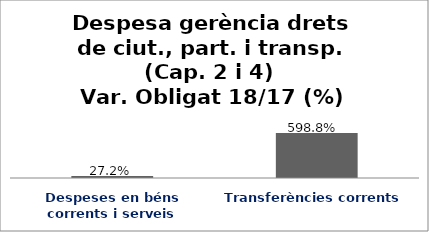
| Category | Series 0 |
|---|---|
| Despeses en béns corrents i serveis | 0.272 |
| Transferències corrents | 5.988 |